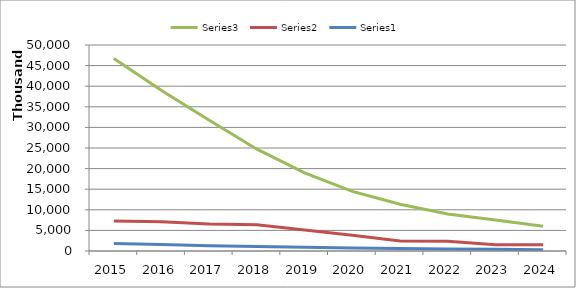
| Category | Series 2 | Series 1 | Series 0 |
|---|---|---|---|
| 2015.0 | 46748988 | 7257181 | 1800000 |
| 2016.0 | 38964903 | 7129323 | 1600000 |
| 2017.0 | 31752865 | 6557276 | 1300000 |
| 2018.0 | 24707174 | 6390929 | 1100000 |
| 2019.0 | 18944136 | 5108276 | 900000 |
| 2020.0 | 14454762 | 3834612 | 700000 |
| 2021.0 | 11350000 | 2450000 | 600000 |
| 2022.0 | 9000000 | 2350000 | 500000 |
| 2023.0 | 7500000 | 1500000 | 400000 |
| 2024.0 | 6000000 | 1500000 | 300000 |